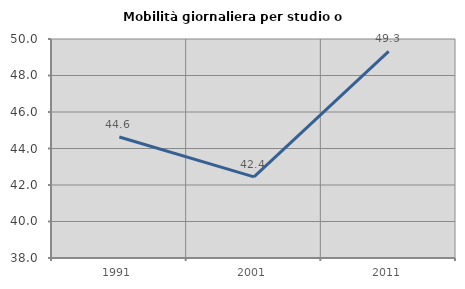
| Category | Mobilità giornaliera per studio o lavoro |
|---|---|
| 1991.0 | 44.632 |
| 2001.0 | 42.448 |
| 2011.0 | 49.326 |